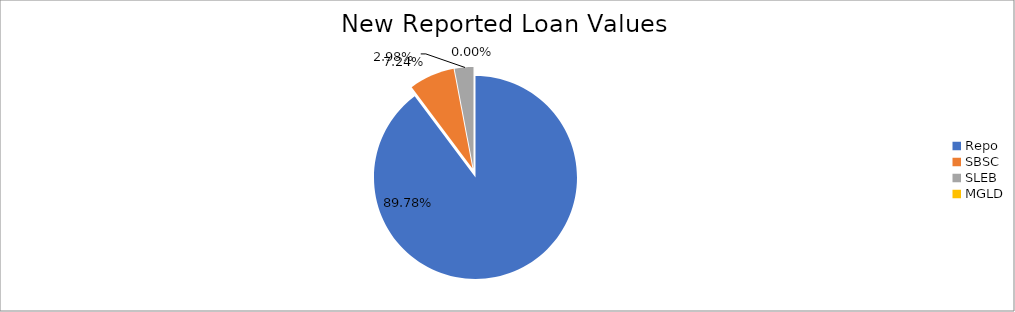
| Category | Series 0 |
|---|---|
| Repo | 11019098.826 |
| SBSC | 888953.891 |
| SLEB | 365864.994 |
| MGLD | 110.389 |